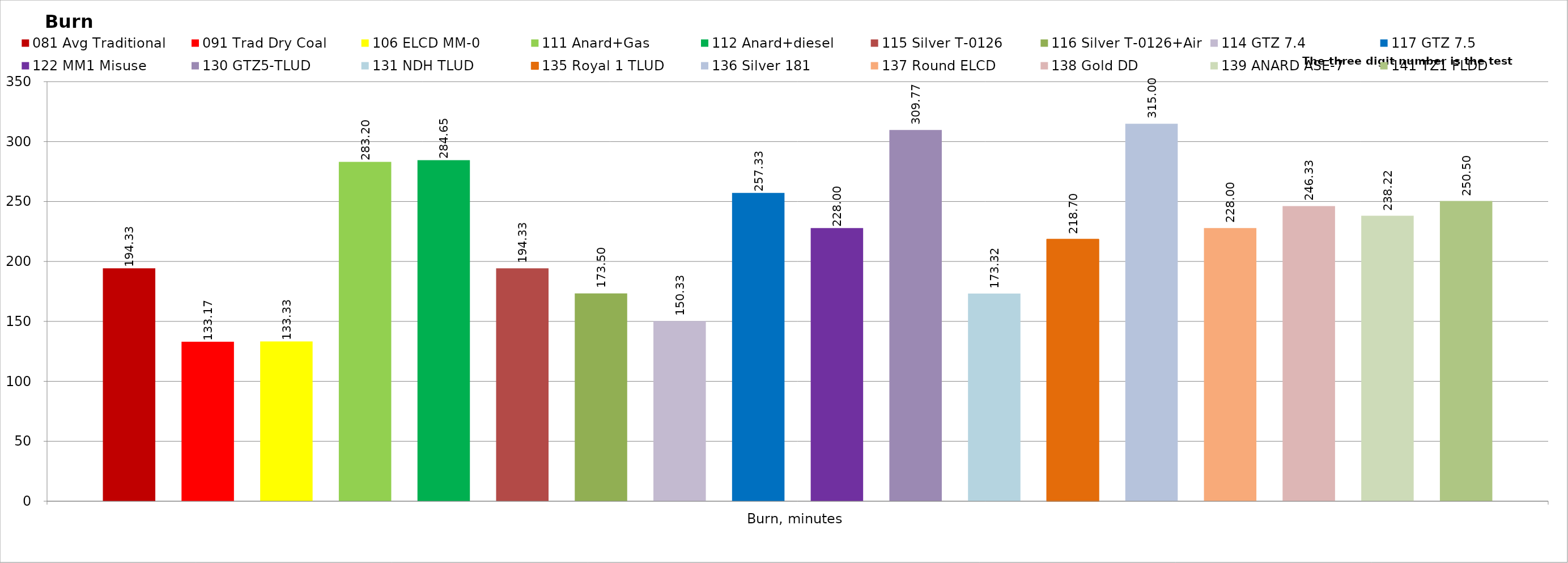
| Category | 081 Avg Traditional | 091 Trad Dry Coal | 106 ELCD MM-0 | 111 Anard+Gas | 112 Anard+diesel | 115 Silver T-0126 | 116 Silver T-0126+Air | 114 GTZ 7.4 | 117 GTZ 7.5 | 122 MM1 Misuse | 130 GTZ5-TLUD | 131 NDH TLUD | 135 Royal 1 TLUD | 136 Silver 181 | 137 Round ELCD | 138 Gold DD | 139 ANARD ASE-7 | 141 TZ1 FLDD |
|---|---|---|---|---|---|---|---|---|---|---|---|---|---|---|---|---|---|---|
| Burn, minutes | 194.333 | 133.167 | 133.333 | 283.2 | 284.65 | 194.333 | 173.5 | 150.333 | 257.333 | 228 | 309.767 | 173.317 | 218.7 | 315 | 228 | 246.333 | 238.217 | 250.5 |